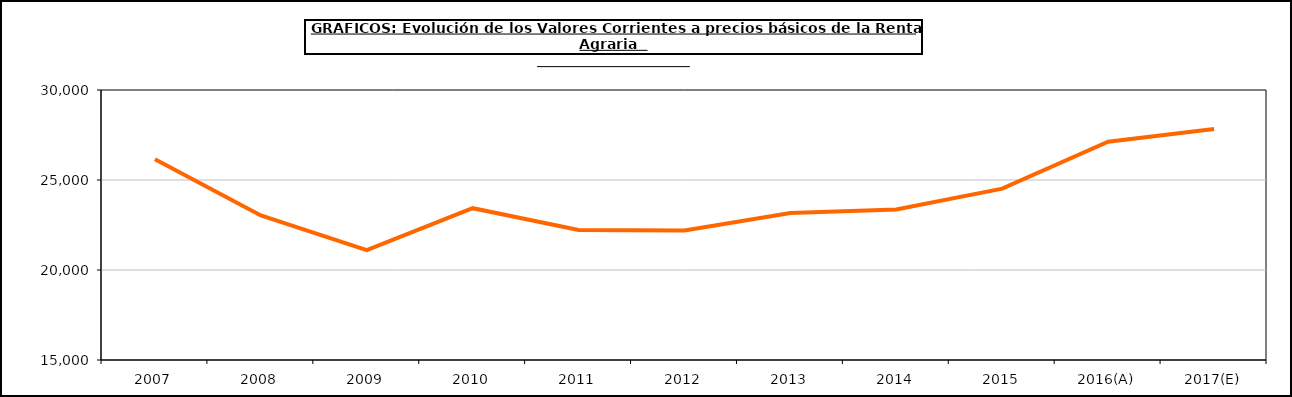
| Category | renta agraria |
|---|---|
| 2007 | 26149.9 |
| 2008 | 23031.6 |
| 2009 | 21101 |
| 2010 | 23433.2 |
| 2011 | 22219.2 |
| 2012 | 22193.5 |
| 2013 | 23161.5 |
| 2014 | 23361.1 |
| 2015 | 24518.8 |
| 2016(A) | 27126.1 |
| 2017(E) | 27831.3 |